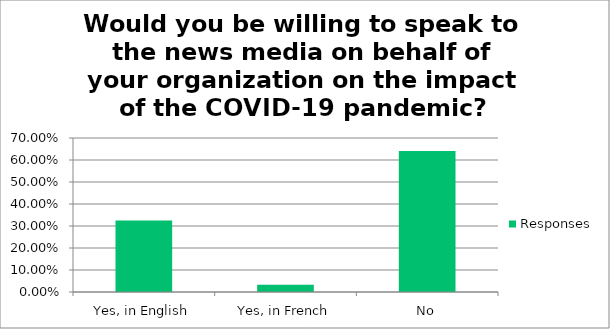
| Category | Responses |
|---|---|
| Yes, in English | 0.326 |
| Yes, in French | 0.033 |
| No | 0.641 |